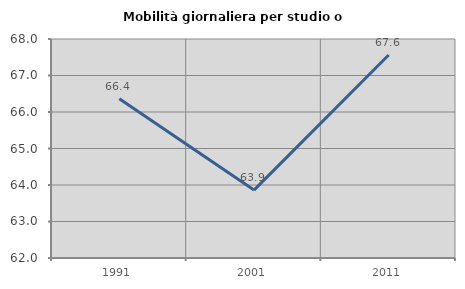
| Category | Mobilità giornaliera per studio o lavoro |
|---|---|
| 1991.0 | 66.364 |
| 2001.0 | 63.861 |
| 2011.0 | 67.562 |